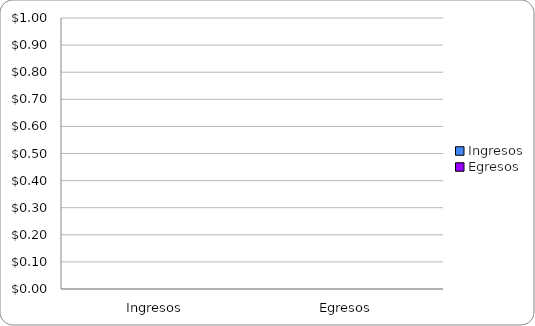
| Category | Series 0 |
|---|---|
| Ingresos | 0 |
| Egresos | 0 |